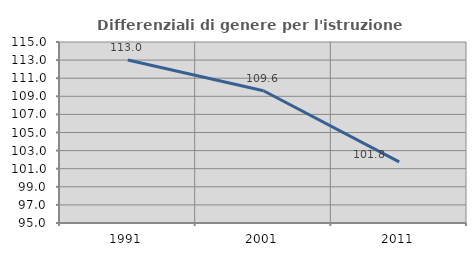
| Category | Differenziali di genere per l'istruzione superiore |
|---|---|
| 1991.0 | 113.005 |
| 2001.0 | 109.612 |
| 2011.0 | 101.754 |